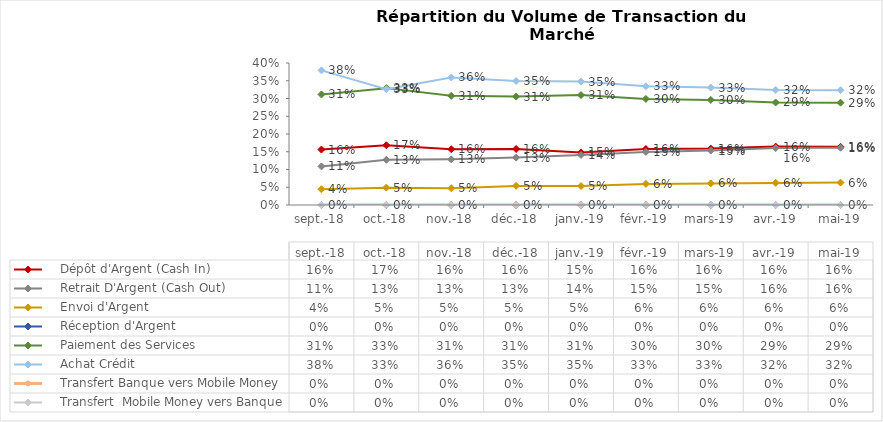
| Category |     Dépôt d'Argent (Cash In) |     Retrait D'Argent (Cash Out)  |     Envoi d'Argent  |     Réception d'Argent |     Paiement des Services |     Achat Crédit |     Transfert Banque vers Mobile Money |     Transfert  Mobile Money vers Banque  |
|---|---|---|---|---|---|---|---|---|
| 2018-09-01 | 0.156 | 0.109 | 0.044 | 0 | 0.311 | 0.379 | 0 | 0 |
| 2018-10-01 | 0.168 | 0.127 | 0.049 | 0 | 0.329 | 0.326 | 0 | 0 |
| 2018-11-01 | 0.157 | 0.129 | 0.047 | 0 | 0.307 | 0.359 | 0 | 0 |
| 2018-12-01 | 0.158 | 0.133 | 0.054 | 0 | 0.305 | 0.349 | 0 | 0 |
| 2019-01-01 | 0.148 | 0.141 | 0.054 | 0 | 0.31 | 0.348 | 0 | 0 |
| 2019-02-01 | 0.158 | 0.15 | 0.059 | 0 | 0.299 | 0.334 | 0 | 0 |
| 2019-03-01 | 0.159 | 0.153 | 0.061 | 0 | 0.296 | 0.331 | 0 | 0 |
| 2019-04-01 | 0.164 | 0.16 | 0.062 | 0 | 0.289 | 0.324 | 0 | 0 |
| 2019-05-01 | 0.164 | 0.161 | 0.063 | 0 | 0.288 | 0.323 | 0 | 0 |